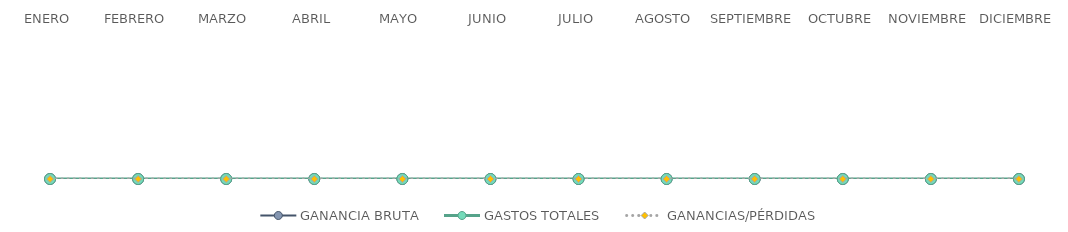
| Category | GANANCIA BRUTA | GASTOS TOTALES | GANANCIAS/PÉRDIDAS |
|---|---|---|---|
| ENERO | 0 | 0 | 0 |
| FEBRERO | 0 | 0 | 0 |
| MARZO | 0 | 0 | 0 |
| ABRIL | 0 | 0 | 0 |
| MAYO | 0 | 0 | 0 |
| JUNIO | 0 | 0 | 0 |
| JULIO | 0 | 0 | 0 |
| AGOSTO | 0 | 0 | 0 |
| SEPTIEMBRE | 0 | 0 | 0 |
| OCTUBRE | 0 | 0 | 0 |
| NOVIEMBRE | 0 | 0 | 0 |
| DICIEMBRE | 0 | 0 | 0 |